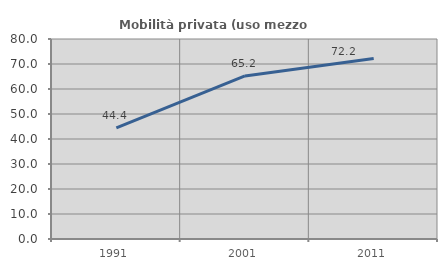
| Category | Mobilità privata (uso mezzo privato) |
|---|---|
| 1991.0 | 44.444 |
| 2001.0 | 65.217 |
| 2011.0 | 72.222 |